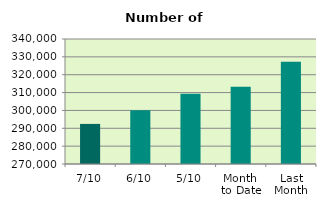
| Category | Series 0 |
|---|---|
| 7/10 | 292450 |
| 6/10 | 300162 |
| 5/10 | 309396 |
| Month 
to Date | 313225.2 |
| Last
Month | 327317.909 |